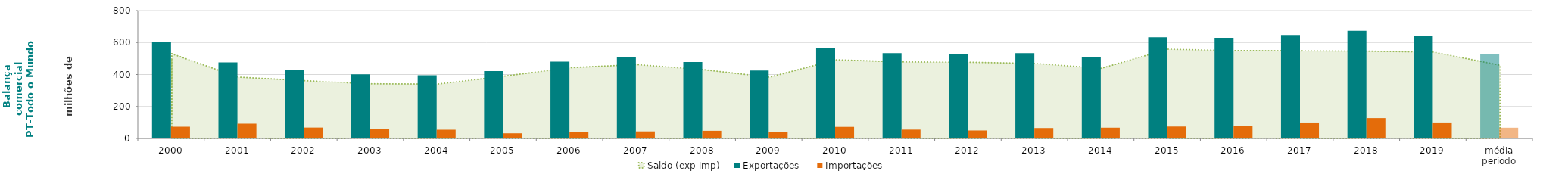
| Category | Exportações  | Importações  |
|---|---|---|
| 2000 | 603.257 | 73.37 |
| 2001 | 476.1 | 92.402 |
| 2002 | 429.586 | 68.07 |
| 2003 | 401.119 | 59.288 |
| 2004 | 394.748 | 54.527 |
| 2005 | 421.259 | 32.137 |
| 2006 | 480.684 | 37.951 |
| 2007 | 506.189 | 43.993 |
| 2008 | 478.345 | 47.836 |
| 2009 | 424.817 | 41.644 |
| 2010 | 564.035 | 72.422 |
| 2011 | 534.142 | 55.21 |
| 2012 | 526.514 | 49.867 |
| 2013 | 534.274 | 65.216 |
| 2014 | 506.348 | 67.339 |
| 2015 | 633.121 | 74.48 |
| 2016 | 629.75 | 80.191 |
| 2017 | 647.86 | 99.579 |
| 2018 | 673.268 | 127.266 |
| 2019 | 640.054 | 99.789 |
| média período | 525.273 | 67.129 |